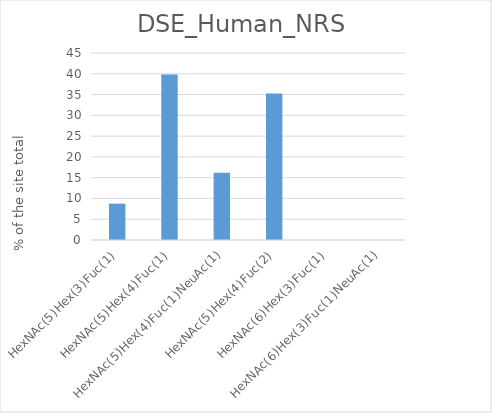
| Category | Series 0 |
|---|---|
| HexNAc(5)Hex(3)Fuc(1) | 8.749 |
| HexNAc(5)Hex(4)Fuc(1) | 39.833 |
| HexNAc(5)Hex(4)Fuc(1)NeuAc(1) | 16.179 |
| HexNAc(5)Hex(4)Fuc(2) | 35.239 |
| HexNAc(6)Hex(3)Fuc(1) | 0 |
| HexNAc(6)Hex(3)Fuc(1)NeuAc(1) | 0 |